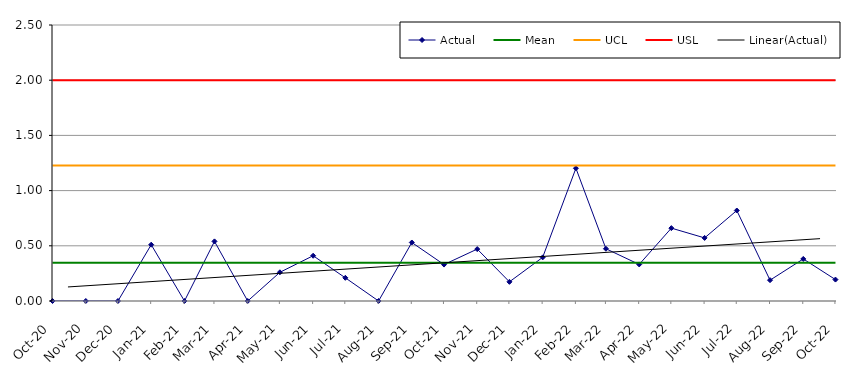
| Category | Actual | Mean | UCL | USL |
|---|---|---|---|---|
| 2020-10-01 | 0 | 0.346 | 1.226 | 2 |
| 2020-11-01 | 0 | 0.346 | 1.226 | 2 |
| 2020-12-01 | 0 | 0.346 | 1.226 | 2 |
| 2021-01-01 | 0.51 | 0.346 | 1.226 | 2 |
| 2021-02-01 | 0 | 0.346 | 1.226 | 2 |
| 2021-03-01 | 0.54 | 0.346 | 1.226 | 2 |
| 2021-04-01 | 0 | 0.346 | 1.226 | 2 |
| 2021-05-01 | 0.26 | 0.346 | 1.226 | 2 |
| 2021-06-01 | 0.41 | 0.346 | 1.226 | 2 |
| 2021-07-01 | 0.21 | 0.346 | 1.226 | 2 |
| 2021-08-01 | 0 | 0.346 | 1.226 | 2 |
| 2021-09-01 | 0.53 | 0.346 | 1.226 | 2 |
| 2021-10-01 | 0.33 | 0.346 | 1.226 | 2 |
| 2021-11-01 | 0.47 | 0.346 | 1.226 | 2 |
| 2021-12-01 | 0.174 | 0.346 | 1.226 | 2 |
| 2022-01-01 | 0.395 | 0.346 | 1.226 | 2 |
| 2022-02-01 | 1.202 | 0.346 | 1.226 | 2 |
| 2022-03-01 | 0.473 | 0.346 | 1.226 | 2 |
| 2022-04-01 | 0.331 | 0.346 | 1.226 | 2 |
| 2022-05-01 | 0.66 | 0.346 | 1.226 | 2 |
| 2022-06-01 | 0.571 | 0.346 | 1.226 | 2 |
| 2022-07-01 | 0.82 | 0.346 | 1.226 | 2 |
| 2022-08-01 | 0.189 | 0.346 | 1.226 | 2 |
| 2022-09-01 | 0.381 | 0.346 | 1.226 | 2 |
| 2022-10-01 | 0.194 | 0.346 | 1.226 | 2 |